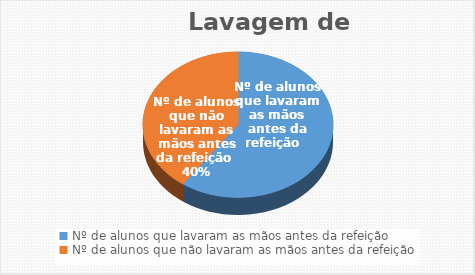
| Category | Series 5 |
|---|---|
| Nº de alunos que lavaram as mãos antes da refeição   | 55 |
| Nº de alunos que não lavaram as mãos antes da refeição  | 37 |